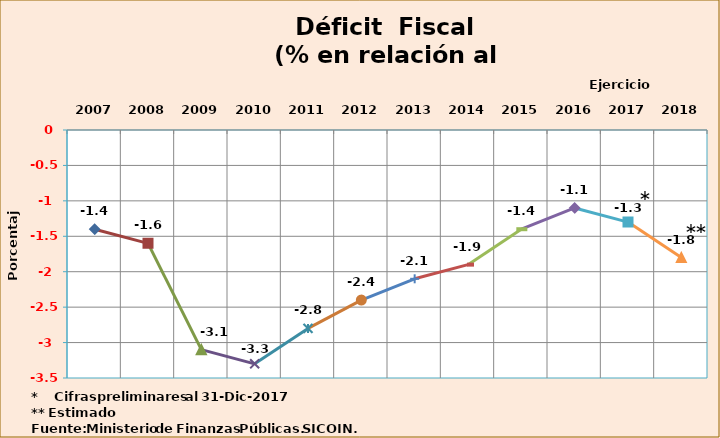
| Category | Series 0 |
|---|---|
| 2007 | -1.4 |
| 2008 | -1.6 |
| 2009 | -3.1 |
| 2010 | -3.3 |
| 2011 | -2.8 |
| 2012 | -2.4 |
| 2013 | -2.1 |
| 2014 | -1.9 |
| 2015 | -1.4 |
| 2016 | -1.1 |
| 2017 | -1.3 |
| 2018 | -1.8 |